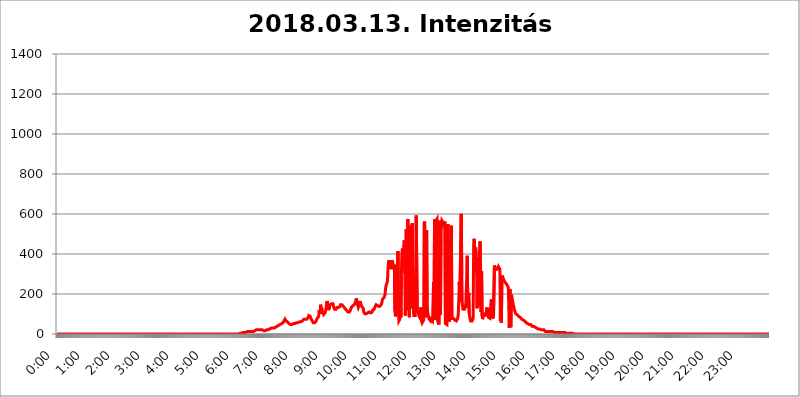
| Category | 2018.03.13. Intenzitás [W/m^2] |
|---|---|
| 0.0 | 0 |
| 0.0006944444444444445 | 0 |
| 0.001388888888888889 | 0 |
| 0.0020833333333333333 | 0 |
| 0.002777777777777778 | 0 |
| 0.003472222222222222 | 0 |
| 0.004166666666666667 | 0 |
| 0.004861111111111111 | 0 |
| 0.005555555555555556 | 0 |
| 0.0062499999999999995 | 0 |
| 0.006944444444444444 | 0 |
| 0.007638888888888889 | 0 |
| 0.008333333333333333 | 0 |
| 0.009027777777777779 | 0 |
| 0.009722222222222222 | 0 |
| 0.010416666666666666 | 0 |
| 0.011111111111111112 | 0 |
| 0.011805555555555555 | 0 |
| 0.012499999999999999 | 0 |
| 0.013194444444444444 | 0 |
| 0.013888888888888888 | 0 |
| 0.014583333333333332 | 0 |
| 0.015277777777777777 | 0 |
| 0.015972222222222224 | 0 |
| 0.016666666666666666 | 0 |
| 0.017361111111111112 | 0 |
| 0.018055555555555557 | 0 |
| 0.01875 | 0 |
| 0.019444444444444445 | 0 |
| 0.02013888888888889 | 0 |
| 0.020833333333333332 | 0 |
| 0.02152777777777778 | 0 |
| 0.022222222222222223 | 0 |
| 0.02291666666666667 | 0 |
| 0.02361111111111111 | 0 |
| 0.024305555555555556 | 0 |
| 0.024999999999999998 | 0 |
| 0.025694444444444447 | 0 |
| 0.02638888888888889 | 0 |
| 0.027083333333333334 | 0 |
| 0.027777777777777776 | 0 |
| 0.02847222222222222 | 0 |
| 0.029166666666666664 | 0 |
| 0.029861111111111113 | 0 |
| 0.030555555555555555 | 0 |
| 0.03125 | 0 |
| 0.03194444444444445 | 0 |
| 0.03263888888888889 | 0 |
| 0.03333333333333333 | 0 |
| 0.034027777777777775 | 0 |
| 0.034722222222222224 | 0 |
| 0.035416666666666666 | 0 |
| 0.036111111111111115 | 0 |
| 0.03680555555555556 | 0 |
| 0.0375 | 0 |
| 0.03819444444444444 | 0 |
| 0.03888888888888889 | 0 |
| 0.03958333333333333 | 0 |
| 0.04027777777777778 | 0 |
| 0.04097222222222222 | 0 |
| 0.041666666666666664 | 0 |
| 0.042361111111111106 | 0 |
| 0.04305555555555556 | 0 |
| 0.043750000000000004 | 0 |
| 0.044444444444444446 | 0 |
| 0.04513888888888889 | 0 |
| 0.04583333333333334 | 0 |
| 0.04652777777777778 | 0 |
| 0.04722222222222222 | 0 |
| 0.04791666666666666 | 0 |
| 0.04861111111111111 | 0 |
| 0.049305555555555554 | 0 |
| 0.049999999999999996 | 0 |
| 0.05069444444444445 | 0 |
| 0.051388888888888894 | 0 |
| 0.052083333333333336 | 0 |
| 0.05277777777777778 | 0 |
| 0.05347222222222222 | 0 |
| 0.05416666666666667 | 0 |
| 0.05486111111111111 | 0 |
| 0.05555555555555555 | 0 |
| 0.05625 | 0 |
| 0.05694444444444444 | 0 |
| 0.057638888888888885 | 0 |
| 0.05833333333333333 | 0 |
| 0.05902777777777778 | 0 |
| 0.059722222222222225 | 0 |
| 0.06041666666666667 | 0 |
| 0.061111111111111116 | 0 |
| 0.06180555555555556 | 0 |
| 0.0625 | 0 |
| 0.06319444444444444 | 0 |
| 0.06388888888888888 | 0 |
| 0.06458333333333334 | 0 |
| 0.06527777777777778 | 0 |
| 0.06597222222222222 | 0 |
| 0.06666666666666667 | 0 |
| 0.06736111111111111 | 0 |
| 0.06805555555555555 | 0 |
| 0.06874999999999999 | 0 |
| 0.06944444444444443 | 0 |
| 0.07013888888888889 | 0 |
| 0.07083333333333333 | 0 |
| 0.07152777777777779 | 0 |
| 0.07222222222222223 | 0 |
| 0.07291666666666667 | 0 |
| 0.07361111111111111 | 0 |
| 0.07430555555555556 | 0 |
| 0.075 | 0 |
| 0.07569444444444444 | 0 |
| 0.0763888888888889 | 0 |
| 0.07708333333333334 | 0 |
| 0.07777777777777778 | 0 |
| 0.07847222222222222 | 0 |
| 0.07916666666666666 | 0 |
| 0.0798611111111111 | 0 |
| 0.08055555555555556 | 0 |
| 0.08125 | 0 |
| 0.08194444444444444 | 0 |
| 0.08263888888888889 | 0 |
| 0.08333333333333333 | 0 |
| 0.08402777777777777 | 0 |
| 0.08472222222222221 | 0 |
| 0.08541666666666665 | 0 |
| 0.08611111111111112 | 0 |
| 0.08680555555555557 | 0 |
| 0.08750000000000001 | 0 |
| 0.08819444444444445 | 0 |
| 0.08888888888888889 | 0 |
| 0.08958333333333333 | 0 |
| 0.09027777777777778 | 0 |
| 0.09097222222222222 | 0 |
| 0.09166666666666667 | 0 |
| 0.09236111111111112 | 0 |
| 0.09305555555555556 | 0 |
| 0.09375 | 0 |
| 0.09444444444444444 | 0 |
| 0.09513888888888888 | 0 |
| 0.09583333333333333 | 0 |
| 0.09652777777777777 | 0 |
| 0.09722222222222222 | 0 |
| 0.09791666666666667 | 0 |
| 0.09861111111111111 | 0 |
| 0.09930555555555555 | 0 |
| 0.09999999999999999 | 0 |
| 0.10069444444444443 | 0 |
| 0.1013888888888889 | 0 |
| 0.10208333333333335 | 0 |
| 0.10277777777777779 | 0 |
| 0.10347222222222223 | 0 |
| 0.10416666666666667 | 0 |
| 0.10486111111111111 | 0 |
| 0.10555555555555556 | 0 |
| 0.10625 | 0 |
| 0.10694444444444444 | 0 |
| 0.1076388888888889 | 0 |
| 0.10833333333333334 | 0 |
| 0.10902777777777778 | 0 |
| 0.10972222222222222 | 0 |
| 0.1111111111111111 | 0 |
| 0.11180555555555556 | 0 |
| 0.11180555555555556 | 0 |
| 0.1125 | 0 |
| 0.11319444444444444 | 0 |
| 0.11388888888888889 | 0 |
| 0.11458333333333333 | 0 |
| 0.11527777777777777 | 0 |
| 0.11597222222222221 | 0 |
| 0.11666666666666665 | 0 |
| 0.1173611111111111 | 0 |
| 0.11805555555555557 | 0 |
| 0.11944444444444445 | 0 |
| 0.12013888888888889 | 0 |
| 0.12083333333333333 | 0 |
| 0.12152777777777778 | 0 |
| 0.12222222222222223 | 0 |
| 0.12291666666666667 | 0 |
| 0.12291666666666667 | 0 |
| 0.12361111111111112 | 0 |
| 0.12430555555555556 | 0 |
| 0.125 | 0 |
| 0.12569444444444444 | 0 |
| 0.12638888888888888 | 0 |
| 0.12708333333333333 | 0 |
| 0.16875 | 0 |
| 0.12847222222222224 | 0 |
| 0.12916666666666668 | 0 |
| 0.12986111111111112 | 0 |
| 0.13055555555555556 | 0 |
| 0.13125 | 0 |
| 0.13194444444444445 | 0 |
| 0.1326388888888889 | 0 |
| 0.13333333333333333 | 0 |
| 0.13402777777777777 | 0 |
| 0.13402777777777777 | 0 |
| 0.13472222222222222 | 0 |
| 0.13541666666666666 | 0 |
| 0.1361111111111111 | 0 |
| 0.13749999999999998 | 0 |
| 0.13819444444444443 | 0 |
| 0.1388888888888889 | 0 |
| 0.13958333333333334 | 0 |
| 0.14027777777777778 | 0 |
| 0.14097222222222222 | 0 |
| 0.14166666666666666 | 0 |
| 0.1423611111111111 | 0 |
| 0.14305555555555557 | 0 |
| 0.14375000000000002 | 0 |
| 0.14444444444444446 | 0 |
| 0.1451388888888889 | 0 |
| 0.1451388888888889 | 0 |
| 0.14652777777777778 | 0 |
| 0.14722222222222223 | 0 |
| 0.14791666666666667 | 0 |
| 0.1486111111111111 | 0 |
| 0.14930555555555555 | 0 |
| 0.15 | 0 |
| 0.15069444444444444 | 0 |
| 0.15138888888888888 | 0 |
| 0.15208333333333332 | 0 |
| 0.15277777777777776 | 0 |
| 0.15347222222222223 | 0 |
| 0.15416666666666667 | 0 |
| 0.15486111111111112 | 0 |
| 0.15555555555555556 | 0 |
| 0.15625 | 0 |
| 0.15694444444444444 | 0 |
| 0.15763888888888888 | 0 |
| 0.15833333333333333 | 0 |
| 0.15902777777777777 | 0 |
| 0.15972222222222224 | 0 |
| 0.16041666666666668 | 0 |
| 0.16111111111111112 | 0 |
| 0.16180555555555556 | 0 |
| 0.1625 | 0 |
| 0.16319444444444445 | 0 |
| 0.1638888888888889 | 0 |
| 0.16458333333333333 | 0 |
| 0.16527777777777777 | 0 |
| 0.16597222222222222 | 0 |
| 0.16666666666666666 | 0 |
| 0.1673611111111111 | 0 |
| 0.16805555555555554 | 0 |
| 0.16874999999999998 | 0 |
| 0.16944444444444443 | 0 |
| 0.17013888888888887 | 0 |
| 0.1708333333333333 | 0 |
| 0.17152777777777775 | 0 |
| 0.17222222222222225 | 0 |
| 0.1729166666666667 | 0 |
| 0.17361111111111113 | 0 |
| 0.17430555555555557 | 0 |
| 0.17500000000000002 | 0 |
| 0.17569444444444446 | 0 |
| 0.1763888888888889 | 0 |
| 0.17708333333333334 | 0 |
| 0.17777777777777778 | 0 |
| 0.17847222222222223 | 0 |
| 0.17916666666666667 | 0 |
| 0.1798611111111111 | 0 |
| 0.18055555555555555 | 0 |
| 0.18125 | 0 |
| 0.18194444444444444 | 0 |
| 0.1826388888888889 | 0 |
| 0.18333333333333335 | 0 |
| 0.1840277777777778 | 0 |
| 0.18472222222222223 | 0 |
| 0.18541666666666667 | 0 |
| 0.18611111111111112 | 0 |
| 0.18680555555555556 | 0 |
| 0.1875 | 0 |
| 0.18819444444444444 | 0 |
| 0.18888888888888888 | 0 |
| 0.18958333333333333 | 0 |
| 0.19027777777777777 | 0 |
| 0.1909722222222222 | 0 |
| 0.19166666666666665 | 0 |
| 0.19236111111111112 | 0 |
| 0.19305555555555554 | 0 |
| 0.19375 | 0 |
| 0.19444444444444445 | 0 |
| 0.1951388888888889 | 0 |
| 0.19583333333333333 | 0 |
| 0.19652777777777777 | 0 |
| 0.19722222222222222 | 0 |
| 0.19791666666666666 | 0 |
| 0.1986111111111111 | 0 |
| 0.19930555555555554 | 0 |
| 0.19999999999999998 | 0 |
| 0.20069444444444443 | 0 |
| 0.20138888888888887 | 0 |
| 0.2020833333333333 | 0 |
| 0.2027777777777778 | 0 |
| 0.2034722222222222 | 0 |
| 0.2041666666666667 | 0 |
| 0.20486111111111113 | 0 |
| 0.20555555555555557 | 0 |
| 0.20625000000000002 | 0 |
| 0.20694444444444446 | 0 |
| 0.2076388888888889 | 0 |
| 0.20833333333333334 | 0 |
| 0.20902777777777778 | 0 |
| 0.20972222222222223 | 0 |
| 0.21041666666666667 | 0 |
| 0.2111111111111111 | 0 |
| 0.21180555555555555 | 0 |
| 0.2125 | 0 |
| 0.21319444444444444 | 0 |
| 0.2138888888888889 | 0 |
| 0.21458333333333335 | 0 |
| 0.2152777777777778 | 0 |
| 0.21597222222222223 | 0 |
| 0.21666666666666667 | 0 |
| 0.21736111111111112 | 0 |
| 0.21805555555555556 | 0 |
| 0.21875 | 0 |
| 0.21944444444444444 | 0 |
| 0.22013888888888888 | 0 |
| 0.22083333333333333 | 0 |
| 0.22152777777777777 | 0 |
| 0.2222222222222222 | 0 |
| 0.22291666666666665 | 0 |
| 0.2236111111111111 | 0 |
| 0.22430555555555556 | 0 |
| 0.225 | 0 |
| 0.22569444444444445 | 0 |
| 0.2263888888888889 | 0 |
| 0.22708333333333333 | 0 |
| 0.22777777777777777 | 0 |
| 0.22847222222222222 | 0 |
| 0.22916666666666666 | 0 |
| 0.2298611111111111 | 0 |
| 0.23055555555555554 | 0 |
| 0.23124999999999998 | 0 |
| 0.23194444444444443 | 0 |
| 0.23263888888888887 | 0 |
| 0.2333333333333333 | 0 |
| 0.2340277777777778 | 0 |
| 0.2347222222222222 | 0 |
| 0.2354166666666667 | 0 |
| 0.23611111111111113 | 0 |
| 0.23680555555555557 | 0 |
| 0.23750000000000002 | 0 |
| 0.23819444444444446 | 0 |
| 0.2388888888888889 | 0 |
| 0.23958333333333334 | 0 |
| 0.24027777777777778 | 0 |
| 0.24097222222222223 | 0 |
| 0.24166666666666667 | 0 |
| 0.2423611111111111 | 0 |
| 0.24305555555555555 | 0 |
| 0.24375 | 0 |
| 0.24444444444444446 | 0 |
| 0.24513888888888888 | 0 |
| 0.24583333333333335 | 0 |
| 0.2465277777777778 | 0 |
| 0.24722222222222223 | 0 |
| 0.24791666666666667 | 0 |
| 0.24861111111111112 | 0 |
| 0.24930555555555556 | 0 |
| 0.25 | 0 |
| 0.25069444444444444 | 0 |
| 0.2513888888888889 | 0 |
| 0.2520833333333333 | 0 |
| 0.25277777777777777 | 0 |
| 0.2534722222222222 | 0 |
| 0.25416666666666665 | 0 |
| 0.2548611111111111 | 0 |
| 0.2555555555555556 | 0 |
| 0.25625000000000003 | 3.525 |
| 0.2569444444444445 | 3.525 |
| 0.2576388888888889 | 3.525 |
| 0.25833333333333336 | 3.525 |
| 0.2590277777777778 | 3.525 |
| 0.25972222222222224 | 3.525 |
| 0.2604166666666667 | 7.887 |
| 0.2611111111111111 | 7.887 |
| 0.26180555555555557 | 7.887 |
| 0.2625 | 7.887 |
| 0.26319444444444445 | 7.887 |
| 0.2638888888888889 | 7.887 |
| 0.26458333333333334 | 7.887 |
| 0.2652777777777778 | 7.887 |
| 0.2659722222222222 | 12.257 |
| 0.26666666666666666 | 12.257 |
| 0.2673611111111111 | 12.257 |
| 0.26805555555555555 | 12.257 |
| 0.26875 | 12.257 |
| 0.26944444444444443 | 12.257 |
| 0.2701388888888889 | 12.257 |
| 0.2708333333333333 | 12.257 |
| 0.27152777777777776 | 12.257 |
| 0.2722222222222222 | 12.257 |
| 0.27291666666666664 | 12.257 |
| 0.2736111111111111 | 12.257 |
| 0.2743055555555555 | 12.257 |
| 0.27499999999999997 | 12.257 |
| 0.27569444444444446 | 16.636 |
| 0.27638888888888885 | 16.636 |
| 0.27708333333333335 | 16.636 |
| 0.2777777777777778 | 16.636 |
| 0.27847222222222223 | 21.024 |
| 0.2791666666666667 | 21.024 |
| 0.2798611111111111 | 21.024 |
| 0.28055555555555556 | 21.024 |
| 0.28125 | 21.024 |
| 0.28194444444444444 | 21.024 |
| 0.2826388888888889 | 21.024 |
| 0.2833333333333333 | 21.024 |
| 0.28402777777777777 | 21.024 |
| 0.2847222222222222 | 21.024 |
| 0.28541666666666665 | 21.024 |
| 0.28611111111111115 | 21.024 |
| 0.28680555555555554 | 21.024 |
| 0.28750000000000003 | 21.024 |
| 0.2881944444444445 | 21.024 |
| 0.2888888888888889 | 16.636 |
| 0.28958333333333336 | 16.636 |
| 0.2902777777777778 | 16.636 |
| 0.29097222222222224 | 16.636 |
| 0.2916666666666667 | 16.636 |
| 0.2923611111111111 | 21.024 |
| 0.29305555555555557 | 21.024 |
| 0.29375 | 21.024 |
| 0.29444444444444445 | 21.024 |
| 0.2951388888888889 | 21.024 |
| 0.29583333333333334 | 21.024 |
| 0.2965277777777778 | 25.419 |
| 0.2972222222222222 | 25.419 |
| 0.29791666666666666 | 25.419 |
| 0.2986111111111111 | 25.419 |
| 0.29930555555555555 | 29.823 |
| 0.3 | 29.823 |
| 0.30069444444444443 | 29.823 |
| 0.3013888888888889 | 29.823 |
| 0.3020833333333333 | 29.823 |
| 0.30277777777777776 | 29.823 |
| 0.3034722222222222 | 29.823 |
| 0.30416666666666664 | 29.823 |
| 0.3048611111111111 | 29.823 |
| 0.3055555555555555 | 34.234 |
| 0.30624999999999997 | 34.234 |
| 0.3069444444444444 | 38.653 |
| 0.3076388888888889 | 38.653 |
| 0.30833333333333335 | 38.653 |
| 0.3090277777777778 | 38.653 |
| 0.30972222222222223 | 43.079 |
| 0.3104166666666667 | 43.079 |
| 0.3111111111111111 | 43.079 |
| 0.31180555555555556 | 47.511 |
| 0.3125 | 47.511 |
| 0.31319444444444444 | 47.511 |
| 0.3138888888888889 | 51.951 |
| 0.3145833333333333 | 51.951 |
| 0.31527777777777777 | 51.951 |
| 0.3159722222222222 | 51.951 |
| 0.31666666666666665 | 56.398 |
| 0.31736111111111115 | 56.398 |
| 0.31805555555555554 | 65.31 |
| 0.31875000000000003 | 65.31 |
| 0.3194444444444445 | 74.246 |
| 0.3201388888888889 | 69.775 |
| 0.32083333333333336 | 65.31 |
| 0.3215277777777778 | 65.31 |
| 0.32222222222222224 | 60.85 |
| 0.3229166666666667 | 60.85 |
| 0.3236111111111111 | 56.398 |
| 0.32430555555555557 | 56.398 |
| 0.325 | 51.951 |
| 0.32569444444444445 | 47.511 |
| 0.3263888888888889 | 47.511 |
| 0.32708333333333334 | 47.511 |
| 0.3277777777777778 | 47.511 |
| 0.3284722222222222 | 47.511 |
| 0.32916666666666666 | 47.511 |
| 0.3298611111111111 | 51.951 |
| 0.33055555555555555 | 51.951 |
| 0.33125 | 51.951 |
| 0.33194444444444443 | 51.951 |
| 0.3326388888888889 | 51.951 |
| 0.3333333333333333 | 51.951 |
| 0.3340277777777778 | 56.398 |
| 0.3347222222222222 | 56.398 |
| 0.3354166666666667 | 56.398 |
| 0.3361111111111111 | 56.398 |
| 0.3368055555555556 | 56.398 |
| 0.33749999999999997 | 56.398 |
| 0.33819444444444446 | 60.85 |
| 0.33888888888888885 | 60.85 |
| 0.33958333333333335 | 60.85 |
| 0.34027777777777773 | 60.85 |
| 0.34097222222222223 | 60.85 |
| 0.3416666666666666 | 60.85 |
| 0.3423611111111111 | 60.85 |
| 0.3430555555555555 | 60.85 |
| 0.34375 | 65.31 |
| 0.3444444444444445 | 65.31 |
| 0.3451388888888889 | 69.775 |
| 0.3458333333333334 | 74.246 |
| 0.34652777777777777 | 74.246 |
| 0.34722222222222227 | 74.246 |
| 0.34791666666666665 | 74.246 |
| 0.34861111111111115 | 74.246 |
| 0.34930555555555554 | 74.246 |
| 0.35000000000000003 | 74.246 |
| 0.3506944444444444 | 74.246 |
| 0.3513888888888889 | 78.722 |
| 0.3520833333333333 | 83.205 |
| 0.3527777777777778 | 92.184 |
| 0.3534722222222222 | 96.682 |
| 0.3541666666666667 | 92.184 |
| 0.3548611111111111 | 87.692 |
| 0.35555555555555557 | 83.205 |
| 0.35625 | 74.246 |
| 0.35694444444444445 | 69.775 |
| 0.3576388888888889 | 65.31 |
| 0.35833333333333334 | 60.85 |
| 0.3590277777777778 | 56.398 |
| 0.3597222222222222 | 56.398 |
| 0.36041666666666666 | 56.398 |
| 0.3611111111111111 | 56.398 |
| 0.36180555555555555 | 56.398 |
| 0.3625 | 60.85 |
| 0.36319444444444443 | 65.31 |
| 0.3638888888888889 | 65.31 |
| 0.3645833333333333 | 78.722 |
| 0.3652777777777778 | 74.246 |
| 0.3659722222222222 | 74.246 |
| 0.3666666666666667 | 87.692 |
| 0.3673611111111111 | 119.235 |
| 0.3680555555555556 | 119.235 |
| 0.36874999999999997 | 101.184 |
| 0.36944444444444446 | 146.423 |
| 0.37013888888888885 | 119.235 |
| 0.37083333333333335 | 132.814 |
| 0.37152777777777773 | 110.201 |
| 0.37222222222222223 | 110.201 |
| 0.3729166666666666 | 105.69 |
| 0.3736111111111111 | 96.682 |
| 0.3743055555555555 | 96.682 |
| 0.375 | 96.682 |
| 0.3756944444444445 | 105.69 |
| 0.3763888888888889 | 110.201 |
| 0.3770833333333334 | 128.284 |
| 0.37777777777777777 | 155.509 |
| 0.37847222222222227 | 164.605 |
| 0.37916666666666665 | 160.056 |
| 0.37986111111111115 | 137.347 |
| 0.38055555555555554 | 119.235 |
| 0.38125000000000003 | 123.758 |
| 0.3819444444444444 | 137.347 |
| 0.3826388888888889 | 146.423 |
| 0.3833333333333333 | 146.423 |
| 0.3840277777777778 | 146.423 |
| 0.3847222222222222 | 150.964 |
| 0.3854166666666667 | 150.964 |
| 0.3861111111111111 | 155.509 |
| 0.38680555555555557 | 150.964 |
| 0.3875 | 137.347 |
| 0.38819444444444445 | 137.347 |
| 0.3888888888888889 | 123.758 |
| 0.38958333333333334 | 119.235 |
| 0.3902777777777778 | 119.235 |
| 0.3909722222222222 | 123.758 |
| 0.39166666666666666 | 128.284 |
| 0.3923611111111111 | 132.814 |
| 0.39305555555555555 | 132.814 |
| 0.39375 | 132.814 |
| 0.39444444444444443 | 132.814 |
| 0.3951388888888889 | 132.814 |
| 0.3958333333333333 | 132.814 |
| 0.3965277777777778 | 137.347 |
| 0.3972222222222222 | 146.423 |
| 0.3979166666666667 | 146.423 |
| 0.3986111111111111 | 146.423 |
| 0.3993055555555556 | 146.423 |
| 0.39999999999999997 | 141.884 |
| 0.40069444444444446 | 141.884 |
| 0.40138888888888885 | 137.347 |
| 0.40208333333333335 | 141.884 |
| 0.40277777777777773 | 132.814 |
| 0.40347222222222223 | 128.284 |
| 0.4041666666666666 | 128.284 |
| 0.4048611111111111 | 123.758 |
| 0.4055555555555555 | 119.235 |
| 0.40625 | 119.235 |
| 0.4069444444444445 | 114.716 |
| 0.4076388888888889 | 110.201 |
| 0.4083333333333334 | 105.69 |
| 0.40902777777777777 | 110.201 |
| 0.40972222222222227 | 110.201 |
| 0.41041666666666665 | 114.716 |
| 0.41111111111111115 | 119.235 |
| 0.41180555555555554 | 123.758 |
| 0.41250000000000003 | 132.814 |
| 0.4131944444444444 | 132.814 |
| 0.4138888888888889 | 137.347 |
| 0.4145833333333333 | 141.884 |
| 0.4152777777777778 | 137.347 |
| 0.4159722222222222 | 137.347 |
| 0.4166666666666667 | 146.423 |
| 0.4173611111111111 | 146.423 |
| 0.41805555555555557 | 146.423 |
| 0.41875 | 164.605 |
| 0.41944444444444445 | 178.264 |
| 0.4201388888888889 | 178.264 |
| 0.42083333333333334 | 150.964 |
| 0.4215277777777778 | 155.509 |
| 0.4222222222222222 | 132.814 |
| 0.42291666666666666 | 137.347 |
| 0.4236111111111111 | 146.423 |
| 0.42430555555555555 | 155.509 |
| 0.425 | 164.605 |
| 0.42569444444444443 | 150.964 |
| 0.4263888888888889 | 146.423 |
| 0.4270833333333333 | 137.347 |
| 0.4277777777777778 | 132.814 |
| 0.4284722222222222 | 132.814 |
| 0.4291666666666667 | 128.284 |
| 0.4298611111111111 | 110.201 |
| 0.4305555555555556 | 105.69 |
| 0.43124999999999997 | 101.184 |
| 0.43194444444444446 | 101.184 |
| 0.43263888888888885 | 101.184 |
| 0.43333333333333335 | 101.184 |
| 0.43402777777777773 | 101.184 |
| 0.43472222222222223 | 101.184 |
| 0.4354166666666666 | 105.69 |
| 0.4361111111111111 | 105.69 |
| 0.4368055555555555 | 110.201 |
| 0.4375 | 110.201 |
| 0.4381944444444445 | 105.69 |
| 0.4388888888888889 | 105.69 |
| 0.4395833333333334 | 105.69 |
| 0.44027777777777777 | 105.69 |
| 0.44097222222222227 | 110.201 |
| 0.44166666666666665 | 110.201 |
| 0.44236111111111115 | 119.235 |
| 0.44305555555555554 | 119.235 |
| 0.44375000000000003 | 119.235 |
| 0.4444444444444444 | 123.758 |
| 0.4451388888888889 | 128.284 |
| 0.4458333333333333 | 137.347 |
| 0.4465277777777778 | 141.884 |
| 0.4472222222222222 | 146.423 |
| 0.4479166666666667 | 141.884 |
| 0.4486111111111111 | 141.884 |
| 0.44930555555555557 | 141.884 |
| 0.45 | 137.347 |
| 0.45069444444444445 | 137.347 |
| 0.4513888888888889 | 137.347 |
| 0.45208333333333334 | 137.347 |
| 0.4527777777777778 | 141.884 |
| 0.4534722222222222 | 141.884 |
| 0.45416666666666666 | 146.423 |
| 0.4548611111111111 | 150.964 |
| 0.45555555555555555 | 155.509 |
| 0.45625 | 173.709 |
| 0.45694444444444443 | 178.264 |
| 0.4576388888888889 | 173.709 |
| 0.4583333333333333 | 182.82 |
| 0.4590277777777778 | 178.264 |
| 0.4597222222222222 | 196.497 |
| 0.4604166666666667 | 223.873 |
| 0.4611111111111111 | 242.127 |
| 0.4618055555555556 | 242.127 |
| 0.46249999999999997 | 255.813 |
| 0.46319444444444446 | 264.932 |
| 0.46388888888888885 | 328.584 |
| 0.46458333333333335 | 355.712 |
| 0.46527777777777773 | 369.23 |
| 0.46597222222222223 | 355.712 |
| 0.4666666666666666 | 346.682 |
| 0.4673611111111111 | 342.162 |
| 0.4680555555555555 | 324.052 |
| 0.46875 | 342.162 |
| 0.4694444444444445 | 369.23 |
| 0.4701388888888889 | 369.23 |
| 0.4708333333333334 | 351.198 |
| 0.47152777777777777 | 333.113 |
| 0.47222222222222227 | 324.052 |
| 0.47291666666666665 | 346.682 |
| 0.47361111111111115 | 114.716 |
| 0.47430555555555554 | 87.692 |
| 0.47500000000000003 | 96.682 |
| 0.4756944444444444 | 214.746 |
| 0.4763888888888889 | 105.69 |
| 0.4770833333333333 | 96.682 |
| 0.4777777777777778 | 414.035 |
| 0.4784722222222222 | 146.423 |
| 0.4791666666666667 | 65.31 |
| 0.4798611111111111 | 60.85 |
| 0.48055555555555557 | 74.246 |
| 0.48125 | 178.264 |
| 0.48194444444444445 | 83.205 |
| 0.4826388888888889 | 292.259 |
| 0.48333333333333334 | 396.164 |
| 0.4840277777777778 | 427.39 |
| 0.4847222222222222 | 414.035 |
| 0.48541666666666666 | 427.39 |
| 0.4861111111111111 | 418.492 |
| 0.48680555555555555 | 467.187 |
| 0.4875 | 301.354 |
| 0.48819444444444443 | 92.184 |
| 0.4888888888888889 | 92.184 |
| 0.4895833333333333 | 523.88 |
| 0.4902777777777778 | 119.235 |
| 0.4909722222222222 | 173.709 |
| 0.4916666666666667 | 575.299 |
| 0.4923611111111111 | 571.049 |
| 0.4930555555555556 | 328.584 |
| 0.49374999999999997 | 83.205 |
| 0.49444444444444446 | 541.121 |
| 0.49513888888888885 | 480.356 |
| 0.49583333333333335 | 497.836 |
| 0.49652777777777773 | 128.284 |
| 0.49722222222222223 | 515.223 |
| 0.4979166666666666 | 553.986 |
| 0.4986111111111111 | 141.884 |
| 0.4993055555555555 | 132.814 |
| 0.5 | 92.184 |
| 0.5006944444444444 | 87.692 |
| 0.5013888888888889 | 92.184 |
| 0.5020833333333333 | 92.184 |
| 0.5027777777777778 | 87.692 |
| 0.5034722222222222 | 592.233 |
| 0.5041666666666667 | 596.45 |
| 0.5048611111111111 | 123.758 |
| 0.5055555555555555 | 105.69 |
| 0.50625 | 119.235 |
| 0.5069444444444444 | 96.682 |
| 0.5076388888888889 | 87.692 |
| 0.5083333333333333 | 83.205 |
| 0.5090277777777777 | 78.722 |
| 0.5097222222222222 | 132.814 |
| 0.5104166666666666 | 83.205 |
| 0.5111111111111112 | 65.31 |
| 0.5118055555555555 | 56.398 |
| 0.5125000000000001 | 51.951 |
| 0.5131944444444444 | 56.398 |
| 0.513888888888889 | 69.775 |
| 0.5145833333333333 | 553.986 |
| 0.5152777777777778 | 562.53 |
| 0.5159722222222222 | 110.201 |
| 0.5166666666666667 | 83.205 |
| 0.517361111111111 | 119.235 |
| 0.5180555555555556 | 519.555 |
| 0.5187499999999999 | 169.156 |
| 0.5194444444444445 | 110.201 |
| 0.5201388888888888 | 105.69 |
| 0.5208333333333334 | 87.692 |
| 0.5215277777777778 | 74.246 |
| 0.5222222222222223 | 78.722 |
| 0.5229166666666667 | 69.775 |
| 0.5236111111111111 | 65.31 |
| 0.5243055555555556 | 74.246 |
| 0.525 | 74.246 |
| 0.5256944444444445 | 69.775 |
| 0.5263888888888889 | 65.31 |
| 0.5270833333333333 | 65.31 |
| 0.5277777777777778 | 260.373 |
| 0.5284722222222222 | 83.205 |
| 0.5291666666666667 | 575.299 |
| 0.5298611111111111 | 101.184 |
| 0.5305555555555556 | 69.775 |
| 0.53125 | 566.793 |
| 0.5319444444444444 | 571.049 |
| 0.5326388888888889 | 575.299 |
| 0.5333333333333333 | 69.775 |
| 0.5340277777777778 | 56.398 |
| 0.5347222222222222 | 56.398 |
| 0.5354166666666667 | 47.511 |
| 0.5361111111111111 | 566.793 |
| 0.5368055555555555 | 132.814 |
| 0.5375 | 96.682 |
| 0.5381944444444444 | 502.192 |
| 0.5388888888888889 | 497.836 |
| 0.5395833333333333 | 566.793 |
| 0.5402777777777777 | 566.793 |
| 0.5409722222222222 | 558.261 |
| 0.5416666666666666 | 553.986 |
| 0.5423611111111112 | 549.704 |
| 0.5430555555555555 | 549.704 |
| 0.5437500000000001 | 562.53 |
| 0.5444444444444444 | 51.951 |
| 0.545138888888889 | 51.951 |
| 0.5458333333333333 | 51.951 |
| 0.5465277777777778 | 47.511 |
| 0.5472222222222222 | 373.729 |
| 0.5479166666666667 | 549.704 |
| 0.548611111111111 | 378.224 |
| 0.5493055555555556 | 74.246 |
| 0.5499999999999999 | 60.85 |
| 0.5506944444444445 | 60.85 |
| 0.5513888888888888 | 480.356 |
| 0.5520833333333334 | 69.775 |
| 0.5527777777777778 | 541.121 |
| 0.5534722222222223 | 83.205 |
| 0.5541666666666667 | 78.722 |
| 0.5548611111111111 | 78.722 |
| 0.5555555555555556 | 78.722 |
| 0.55625 | 74.246 |
| 0.5569444444444445 | 74.246 |
| 0.5576388888888889 | 69.775 |
| 0.5583333333333333 | 69.775 |
| 0.5590277777777778 | 65.31 |
| 0.5597222222222222 | 65.31 |
| 0.5604166666666667 | 65.31 |
| 0.5611111111111111 | 74.246 |
| 0.5618055555555556 | 83.205 |
| 0.5625 | 101.184 |
| 0.5631944444444444 | 169.156 |
| 0.5638888888888889 | 260.373 |
| 0.5645833333333333 | 160.056 |
| 0.5652777777777778 | 164.605 |
| 0.5659722222222222 | 155.509 |
| 0.5666666666666667 | 600.661 |
| 0.5673611111111111 | 296.808 |
| 0.5680555555555555 | 150.964 |
| 0.56875 | 132.814 |
| 0.5694444444444444 | 119.235 |
| 0.5701388888888889 | 146.423 |
| 0.5708333333333333 | 119.235 |
| 0.5715277777777777 | 128.284 |
| 0.5722222222222222 | 128.284 |
| 0.5729166666666666 | 137.347 |
| 0.5736111111111112 | 132.814 |
| 0.5743055555555555 | 287.709 |
| 0.5750000000000001 | 391.685 |
| 0.5756944444444444 | 182.82 |
| 0.576388888888889 | 132.814 |
| 0.5770833333333333 | 205.62 |
| 0.5777777777777778 | 101.184 |
| 0.5784722222222222 | 87.692 |
| 0.5791666666666667 | 74.246 |
| 0.579861111111111 | 65.31 |
| 0.5805555555555556 | 65.31 |
| 0.5812499999999999 | 65.31 |
| 0.5819444444444445 | 65.31 |
| 0.5826388888888888 | 69.775 |
| 0.5833333333333334 | 78.722 |
| 0.5840277777777778 | 436.27 |
| 0.5847222222222223 | 475.972 |
| 0.5854166666666667 | 471.582 |
| 0.5861111111111111 | 314.98 |
| 0.5868055555555556 | 431.833 |
| 0.5875 | 391.685 |
| 0.5881944444444445 | 305.898 |
| 0.5888888888888889 | 128.284 |
| 0.5895833333333333 | 305.898 |
| 0.5902777777777778 | 141.884 |
| 0.5909722222222222 | 382.715 |
| 0.5916666666666667 | 278.603 |
| 0.5923611111111111 | 418.492 |
| 0.5930555555555556 | 462.786 |
| 0.59375 | 319.517 |
| 0.5944444444444444 | 110.201 |
| 0.5951388888888889 | 314.98 |
| 0.5958333333333333 | 92.184 |
| 0.5965277777777778 | 74.246 |
| 0.5972222222222222 | 83.205 |
| 0.5979166666666667 | 96.682 |
| 0.5986111111111111 | 96.682 |
| 0.5993055555555555 | 92.184 |
| 0.6 | 101.184 |
| 0.6006944444444444 | 87.692 |
| 0.6013888888888889 | 101.184 |
| 0.6020833333333333 | 123.758 |
| 0.6027777777777777 | 132.814 |
| 0.6034722222222222 | 101.184 |
| 0.6041666666666666 | 128.284 |
| 0.6048611111111112 | 83.205 |
| 0.6055555555555555 | 83.205 |
| 0.6062500000000001 | 83.205 |
| 0.6069444444444444 | 78.722 |
| 0.607638888888889 | 101.184 |
| 0.6083333333333333 | 164.605 |
| 0.6090277777777778 | 173.709 |
| 0.6097222222222222 | 78.722 |
| 0.6104166666666667 | 87.692 |
| 0.611111111111111 | 83.205 |
| 0.6118055555555556 | 78.722 |
| 0.6124999999999999 | 78.722 |
| 0.6131944444444445 | 342.162 |
| 0.6138888888888888 | 333.113 |
| 0.6145833333333334 | 324.052 |
| 0.6152777777777778 | 328.584 |
| 0.6159722222222223 | 324.052 |
| 0.6166666666666667 | 324.052 |
| 0.6173611111111111 | 328.584 |
| 0.6180555555555556 | 333.113 |
| 0.61875 | 319.517 |
| 0.6194444444444445 | 333.113 |
| 0.6201388888888889 | 333.113 |
| 0.6208333333333333 | 324.052 |
| 0.6215277777777778 | 65.31 |
| 0.6222222222222222 | 283.156 |
| 0.6229166666666667 | 56.398 |
| 0.6236111111111111 | 274.047 |
| 0.6243055555555556 | 292.259 |
| 0.625 | 283.156 |
| 0.6256944444444444 | 274.047 |
| 0.6263888888888889 | 269.49 |
| 0.6270833333333333 | 269.49 |
| 0.6277777777777778 | 260.373 |
| 0.6284722222222222 | 260.373 |
| 0.6291666666666667 | 255.813 |
| 0.6298611111111111 | 251.251 |
| 0.6305555555555555 | 246.689 |
| 0.63125 | 242.127 |
| 0.6319444444444444 | 237.564 |
| 0.6326388888888889 | 233 |
| 0.6333333333333333 | 228.436 |
| 0.6340277777777777 | 29.823 |
| 0.6347222222222222 | 223.873 |
| 0.6354166666666666 | 214.746 |
| 0.6361111111111112 | 34.234 |
| 0.6368055555555555 | 196.497 |
| 0.6375000000000001 | 187.378 |
| 0.6381944444444444 | 173.709 |
| 0.638888888888889 | 160.056 |
| 0.6395833333333333 | 146.423 |
| 0.6402777777777778 | 137.347 |
| 0.6409722222222222 | 123.758 |
| 0.6416666666666667 | 114.716 |
| 0.642361111111111 | 110.201 |
| 0.6430555555555556 | 101.184 |
| 0.6437499999999999 | 101.184 |
| 0.6444444444444445 | 96.682 |
| 0.6451388888888888 | 96.682 |
| 0.6458333333333334 | 92.184 |
| 0.6465277777777778 | 92.184 |
| 0.6472222222222223 | 87.692 |
| 0.6479166666666667 | 83.205 |
| 0.6486111111111111 | 83.205 |
| 0.6493055555555556 | 83.205 |
| 0.65 | 78.722 |
| 0.6506944444444445 | 78.722 |
| 0.6513888888888889 | 74.246 |
| 0.6520833333333333 | 74.246 |
| 0.6527777777777778 | 69.775 |
| 0.6534722222222222 | 69.775 |
| 0.6541666666666667 | 65.31 |
| 0.6548611111111111 | 65.31 |
| 0.6555555555555556 | 65.31 |
| 0.65625 | 60.85 |
| 0.6569444444444444 | 60.85 |
| 0.6576388888888889 | 56.398 |
| 0.6583333333333333 | 56.398 |
| 0.6590277777777778 | 51.951 |
| 0.6597222222222222 | 51.951 |
| 0.6604166666666667 | 51.951 |
| 0.6611111111111111 | 47.511 |
| 0.6618055555555555 | 47.511 |
| 0.6625 | 47.511 |
| 0.6631944444444444 | 47.511 |
| 0.6638888888888889 | 47.511 |
| 0.6645833333333333 | 43.079 |
| 0.6652777777777777 | 43.079 |
| 0.6659722222222222 | 38.653 |
| 0.6666666666666666 | 38.653 |
| 0.6673611111111111 | 38.653 |
| 0.6680555555555556 | 38.653 |
| 0.6687500000000001 | 34.234 |
| 0.6694444444444444 | 34.234 |
| 0.6701388888888888 | 34.234 |
| 0.6708333333333334 | 29.823 |
| 0.6715277777777778 | 29.823 |
| 0.6722222222222222 | 29.823 |
| 0.6729166666666666 | 29.823 |
| 0.6736111111111112 | 25.419 |
| 0.6743055555555556 | 25.419 |
| 0.6749999999999999 | 25.419 |
| 0.6756944444444444 | 25.419 |
| 0.6763888888888889 | 25.419 |
| 0.6770833333333334 | 25.419 |
| 0.6777777777777777 | 21.024 |
| 0.6784722222222223 | 21.024 |
| 0.6791666666666667 | 21.024 |
| 0.6798611111111111 | 21.024 |
| 0.6805555555555555 | 21.024 |
| 0.68125 | 21.024 |
| 0.6819444444444445 | 16.636 |
| 0.6826388888888889 | 21.024 |
| 0.6833333333333332 | 16.636 |
| 0.6840277777777778 | 16.636 |
| 0.6847222222222222 | 12.257 |
| 0.6854166666666667 | 12.257 |
| 0.686111111111111 | 12.257 |
| 0.6868055555555556 | 12.257 |
| 0.6875 | 12.257 |
| 0.6881944444444444 | 12.257 |
| 0.688888888888889 | 12.257 |
| 0.6895833333333333 | 12.257 |
| 0.6902777777777778 | 12.257 |
| 0.6909722222222222 | 12.257 |
| 0.6916666666666668 | 12.257 |
| 0.6923611111111111 | 12.257 |
| 0.6930555555555555 | 12.257 |
| 0.69375 | 12.257 |
| 0.6944444444444445 | 12.257 |
| 0.6951388888888889 | 12.257 |
| 0.6958333333333333 | 12.257 |
| 0.6965277777777777 | 12.257 |
| 0.6972222222222223 | 7.887 |
| 0.6979166666666666 | 7.887 |
| 0.6986111111111111 | 7.887 |
| 0.6993055555555556 | 7.887 |
| 0.7000000000000001 | 7.887 |
| 0.7006944444444444 | 7.887 |
| 0.7013888888888888 | 7.887 |
| 0.7020833333333334 | 7.887 |
| 0.7027777777777778 | 7.887 |
| 0.7034722222222222 | 7.887 |
| 0.7041666666666666 | 7.887 |
| 0.7048611111111112 | 7.887 |
| 0.7055555555555556 | 7.887 |
| 0.7062499999999999 | 7.887 |
| 0.7069444444444444 | 7.887 |
| 0.7076388888888889 | 7.887 |
| 0.7083333333333334 | 7.887 |
| 0.7090277777777777 | 7.887 |
| 0.7097222222222223 | 7.887 |
| 0.7104166666666667 | 7.887 |
| 0.7111111111111111 | 3.525 |
| 0.7118055555555555 | 7.887 |
| 0.7125 | 7.887 |
| 0.7131944444444445 | 3.525 |
| 0.7138888888888889 | 3.525 |
| 0.7145833333333332 | 3.525 |
| 0.7152777777777778 | 3.525 |
| 0.7159722222222222 | 3.525 |
| 0.7166666666666667 | 3.525 |
| 0.717361111111111 | 3.525 |
| 0.7180555555555556 | 3.525 |
| 0.71875 | 3.525 |
| 0.7194444444444444 | 3.525 |
| 0.720138888888889 | 3.525 |
| 0.7208333333333333 | 3.525 |
| 0.7215277777777778 | 3.525 |
| 0.7222222222222222 | 3.525 |
| 0.7229166666666668 | 3.525 |
| 0.7236111111111111 | 0 |
| 0.7243055555555555 | 0 |
| 0.725 | 0 |
| 0.7256944444444445 | 0 |
| 0.7263888888888889 | 0 |
| 0.7270833333333333 | 0 |
| 0.7277777777777777 | 0 |
| 0.7284722222222223 | 0 |
| 0.7291666666666666 | 0 |
| 0.7298611111111111 | 0 |
| 0.7305555555555556 | 0 |
| 0.7312500000000001 | 0 |
| 0.7319444444444444 | 0 |
| 0.7326388888888888 | 0 |
| 0.7333333333333334 | 0 |
| 0.7340277777777778 | 0 |
| 0.7347222222222222 | 0 |
| 0.7354166666666666 | 0 |
| 0.7361111111111112 | 0 |
| 0.7368055555555556 | 0 |
| 0.7374999999999999 | 0 |
| 0.7381944444444444 | 0 |
| 0.7388888888888889 | 0 |
| 0.7395833333333334 | 0 |
| 0.7402777777777777 | 0 |
| 0.7409722222222223 | 0 |
| 0.7416666666666667 | 0 |
| 0.7423611111111111 | 0 |
| 0.7430555555555555 | 0 |
| 0.74375 | 0 |
| 0.7444444444444445 | 0 |
| 0.7451388888888889 | 0 |
| 0.7458333333333332 | 0 |
| 0.7465277777777778 | 0 |
| 0.7472222222222222 | 0 |
| 0.7479166666666667 | 0 |
| 0.748611111111111 | 0 |
| 0.7493055555555556 | 0 |
| 0.75 | 0 |
| 0.7506944444444444 | 0 |
| 0.751388888888889 | 0 |
| 0.7520833333333333 | 0 |
| 0.7527777777777778 | 0 |
| 0.7534722222222222 | 0 |
| 0.7541666666666668 | 0 |
| 0.7548611111111111 | 0 |
| 0.7555555555555555 | 0 |
| 0.75625 | 0 |
| 0.7569444444444445 | 0 |
| 0.7576388888888889 | 0 |
| 0.7583333333333333 | 0 |
| 0.7590277777777777 | 0 |
| 0.7597222222222223 | 0 |
| 0.7604166666666666 | 0 |
| 0.7611111111111111 | 0 |
| 0.7618055555555556 | 0 |
| 0.7625000000000001 | 0 |
| 0.7631944444444444 | 0 |
| 0.7638888888888888 | 0 |
| 0.7645833333333334 | 0 |
| 0.7652777777777778 | 0 |
| 0.7659722222222222 | 0 |
| 0.7666666666666666 | 0 |
| 0.7673611111111112 | 0 |
| 0.7680555555555556 | 0 |
| 0.7687499999999999 | 0 |
| 0.7694444444444444 | 0 |
| 0.7701388888888889 | 0 |
| 0.7708333333333334 | 0 |
| 0.7715277777777777 | 0 |
| 0.7722222222222223 | 0 |
| 0.7729166666666667 | 0 |
| 0.7736111111111111 | 0 |
| 0.7743055555555555 | 0 |
| 0.775 | 0 |
| 0.7756944444444445 | 0 |
| 0.7763888888888889 | 0 |
| 0.7770833333333332 | 0 |
| 0.7777777777777778 | 0 |
| 0.7784722222222222 | 0 |
| 0.7791666666666667 | 0 |
| 0.779861111111111 | 0 |
| 0.7805555555555556 | 0 |
| 0.78125 | 0 |
| 0.7819444444444444 | 0 |
| 0.782638888888889 | 0 |
| 0.7833333333333333 | 0 |
| 0.7840277777777778 | 0 |
| 0.7847222222222222 | 0 |
| 0.7854166666666668 | 0 |
| 0.7861111111111111 | 0 |
| 0.7868055555555555 | 0 |
| 0.7875 | 0 |
| 0.7881944444444445 | 0 |
| 0.7888888888888889 | 0 |
| 0.7895833333333333 | 0 |
| 0.7902777777777777 | 0 |
| 0.7909722222222223 | 0 |
| 0.7916666666666666 | 0 |
| 0.7923611111111111 | 0 |
| 0.7930555555555556 | 0 |
| 0.7937500000000001 | 0 |
| 0.7944444444444444 | 0 |
| 0.7951388888888888 | 0 |
| 0.7958333333333334 | 0 |
| 0.7965277777777778 | 0 |
| 0.7972222222222222 | 0 |
| 0.7979166666666666 | 0 |
| 0.7986111111111112 | 0 |
| 0.7993055555555556 | 0 |
| 0.7999999999999999 | 0 |
| 0.8006944444444444 | 0 |
| 0.8013888888888889 | 0 |
| 0.8020833333333334 | 0 |
| 0.8027777777777777 | 0 |
| 0.8034722222222223 | 0 |
| 0.8041666666666667 | 0 |
| 0.8048611111111111 | 0 |
| 0.8055555555555555 | 0 |
| 0.80625 | 0 |
| 0.8069444444444445 | 0 |
| 0.8076388888888889 | 0 |
| 0.8083333333333332 | 0 |
| 0.8090277777777778 | 0 |
| 0.8097222222222222 | 0 |
| 0.8104166666666667 | 0 |
| 0.811111111111111 | 0 |
| 0.8118055555555556 | 0 |
| 0.8125 | 0 |
| 0.8131944444444444 | 0 |
| 0.813888888888889 | 0 |
| 0.8145833333333333 | 0 |
| 0.8152777777777778 | 0 |
| 0.8159722222222222 | 0 |
| 0.8166666666666668 | 0 |
| 0.8173611111111111 | 0 |
| 0.8180555555555555 | 0 |
| 0.81875 | 0 |
| 0.8194444444444445 | 0 |
| 0.8201388888888889 | 0 |
| 0.8208333333333333 | 0 |
| 0.8215277777777777 | 0 |
| 0.8222222222222223 | 0 |
| 0.8229166666666666 | 0 |
| 0.8236111111111111 | 0 |
| 0.8243055555555556 | 0 |
| 0.8250000000000001 | 0 |
| 0.8256944444444444 | 0 |
| 0.8263888888888888 | 0 |
| 0.8270833333333334 | 0 |
| 0.8277777777777778 | 0 |
| 0.8284722222222222 | 0 |
| 0.8291666666666666 | 0 |
| 0.8298611111111112 | 0 |
| 0.8305555555555556 | 0 |
| 0.8312499999999999 | 0 |
| 0.8319444444444444 | 0 |
| 0.8326388888888889 | 0 |
| 0.8333333333333334 | 0 |
| 0.8340277777777777 | 0 |
| 0.8347222222222223 | 0 |
| 0.8354166666666667 | 0 |
| 0.8361111111111111 | 0 |
| 0.8368055555555555 | 0 |
| 0.8375 | 0 |
| 0.8381944444444445 | 0 |
| 0.8388888888888889 | 0 |
| 0.8395833333333332 | 0 |
| 0.8402777777777778 | 0 |
| 0.8409722222222222 | 0 |
| 0.8416666666666667 | 0 |
| 0.842361111111111 | 0 |
| 0.8430555555555556 | 0 |
| 0.84375 | 0 |
| 0.8444444444444444 | 0 |
| 0.845138888888889 | 0 |
| 0.8458333333333333 | 0 |
| 0.8465277777777778 | 0 |
| 0.8472222222222222 | 0 |
| 0.8479166666666668 | 0 |
| 0.8486111111111111 | 0 |
| 0.8493055555555555 | 0 |
| 0.85 | 0 |
| 0.8506944444444445 | 0 |
| 0.8513888888888889 | 0 |
| 0.8520833333333333 | 0 |
| 0.8527777777777777 | 0 |
| 0.8534722222222223 | 0 |
| 0.8541666666666666 | 0 |
| 0.8548611111111111 | 0 |
| 0.8555555555555556 | 0 |
| 0.8562500000000001 | 0 |
| 0.8569444444444444 | 0 |
| 0.8576388888888888 | 0 |
| 0.8583333333333334 | 0 |
| 0.8590277777777778 | 0 |
| 0.8597222222222222 | 0 |
| 0.8604166666666666 | 0 |
| 0.8611111111111112 | 0 |
| 0.8618055555555556 | 0 |
| 0.8624999999999999 | 0 |
| 0.8631944444444444 | 0 |
| 0.8638888888888889 | 0 |
| 0.8645833333333334 | 0 |
| 0.8652777777777777 | 0 |
| 0.8659722222222223 | 0 |
| 0.8666666666666667 | 0 |
| 0.8673611111111111 | 0 |
| 0.8680555555555555 | 0 |
| 0.86875 | 0 |
| 0.8694444444444445 | 0 |
| 0.8701388888888889 | 0 |
| 0.8708333333333332 | 0 |
| 0.8715277777777778 | 0 |
| 0.8722222222222222 | 0 |
| 0.8729166666666667 | 0 |
| 0.873611111111111 | 0 |
| 0.8743055555555556 | 0 |
| 0.875 | 0 |
| 0.8756944444444444 | 0 |
| 0.876388888888889 | 0 |
| 0.8770833333333333 | 0 |
| 0.8777777777777778 | 0 |
| 0.8784722222222222 | 0 |
| 0.8791666666666668 | 0 |
| 0.8798611111111111 | 0 |
| 0.8805555555555555 | 0 |
| 0.88125 | 0 |
| 0.8819444444444445 | 0 |
| 0.8826388888888889 | 0 |
| 0.8833333333333333 | 0 |
| 0.8840277777777777 | 0 |
| 0.8847222222222223 | 0 |
| 0.8854166666666666 | 0 |
| 0.8861111111111111 | 0 |
| 0.8868055555555556 | 0 |
| 0.8875000000000001 | 0 |
| 0.8881944444444444 | 0 |
| 0.8888888888888888 | 0 |
| 0.8895833333333334 | 0 |
| 0.8902777777777778 | 0 |
| 0.8909722222222222 | 0 |
| 0.8916666666666666 | 0 |
| 0.8923611111111112 | 0 |
| 0.8930555555555556 | 0 |
| 0.8937499999999999 | 0 |
| 0.8944444444444444 | 0 |
| 0.8951388888888889 | 0 |
| 0.8958333333333334 | 0 |
| 0.8965277777777777 | 0 |
| 0.8972222222222223 | 0 |
| 0.8979166666666667 | 0 |
| 0.8986111111111111 | 0 |
| 0.8993055555555555 | 0 |
| 0.9 | 0 |
| 0.9006944444444445 | 0 |
| 0.9013888888888889 | 0 |
| 0.9020833333333332 | 0 |
| 0.9027777777777778 | 0 |
| 0.9034722222222222 | 0 |
| 0.9041666666666667 | 0 |
| 0.904861111111111 | 0 |
| 0.9055555555555556 | 0 |
| 0.90625 | 0 |
| 0.9069444444444444 | 0 |
| 0.907638888888889 | 0 |
| 0.9083333333333333 | 0 |
| 0.9090277777777778 | 0 |
| 0.9097222222222222 | 0 |
| 0.9104166666666668 | 0 |
| 0.9111111111111111 | 0 |
| 0.9118055555555555 | 0 |
| 0.9125 | 0 |
| 0.9131944444444445 | 0 |
| 0.9138888888888889 | 0 |
| 0.9145833333333333 | 0 |
| 0.9152777777777777 | 0 |
| 0.9159722222222223 | 0 |
| 0.9166666666666666 | 0 |
| 0.9173611111111111 | 0 |
| 0.9180555555555556 | 0 |
| 0.9187500000000001 | 0 |
| 0.9194444444444444 | 0 |
| 0.9201388888888888 | 0 |
| 0.9208333333333334 | 0 |
| 0.9215277777777778 | 0 |
| 0.9222222222222222 | 0 |
| 0.9229166666666666 | 0 |
| 0.9236111111111112 | 0 |
| 0.9243055555555556 | 0 |
| 0.9249999999999999 | 0 |
| 0.9256944444444444 | 0 |
| 0.9263888888888889 | 0 |
| 0.9270833333333334 | 0 |
| 0.9277777777777777 | 0 |
| 0.9284722222222223 | 0 |
| 0.9291666666666667 | 0 |
| 0.9298611111111111 | 0 |
| 0.9305555555555555 | 0 |
| 0.93125 | 0 |
| 0.9319444444444445 | 0 |
| 0.9326388888888889 | 0 |
| 0.9333333333333332 | 0 |
| 0.9340277777777778 | 0 |
| 0.9347222222222222 | 0 |
| 0.9354166666666667 | 0 |
| 0.936111111111111 | 0 |
| 0.9368055555555556 | 0 |
| 0.9375 | 0 |
| 0.9381944444444444 | 0 |
| 0.938888888888889 | 0 |
| 0.9395833333333333 | 0 |
| 0.9402777777777778 | 0 |
| 0.9409722222222222 | 0 |
| 0.9416666666666668 | 0 |
| 0.9423611111111111 | 0 |
| 0.9430555555555555 | 0 |
| 0.94375 | 0 |
| 0.9444444444444445 | 0 |
| 0.9451388888888889 | 0 |
| 0.9458333333333333 | 0 |
| 0.9465277777777777 | 0 |
| 0.9472222222222223 | 0 |
| 0.9479166666666666 | 0 |
| 0.9486111111111111 | 0 |
| 0.9493055555555556 | 0 |
| 0.9500000000000001 | 0 |
| 0.9506944444444444 | 0 |
| 0.9513888888888888 | 0 |
| 0.9520833333333334 | 0 |
| 0.9527777777777778 | 0 |
| 0.9534722222222222 | 0 |
| 0.9541666666666666 | 0 |
| 0.9548611111111112 | 0 |
| 0.9555555555555556 | 0 |
| 0.9562499999999999 | 0 |
| 0.9569444444444444 | 0 |
| 0.9576388888888889 | 0 |
| 0.9583333333333334 | 0 |
| 0.9590277777777777 | 0 |
| 0.9597222222222223 | 0 |
| 0.9604166666666667 | 0 |
| 0.9611111111111111 | 0 |
| 0.9618055555555555 | 0 |
| 0.9625 | 0 |
| 0.9631944444444445 | 0 |
| 0.9638888888888889 | 0 |
| 0.9645833333333332 | 0 |
| 0.9652777777777778 | 0 |
| 0.9659722222222222 | 0 |
| 0.9666666666666667 | 0 |
| 0.967361111111111 | 0 |
| 0.9680555555555556 | 0 |
| 0.96875 | 0 |
| 0.9694444444444444 | 0 |
| 0.970138888888889 | 0 |
| 0.9708333333333333 | 0 |
| 0.9715277777777778 | 0 |
| 0.9722222222222222 | 0 |
| 0.9729166666666668 | 0 |
| 0.9736111111111111 | 0 |
| 0.9743055555555555 | 0 |
| 0.975 | 0 |
| 0.9756944444444445 | 0 |
| 0.9763888888888889 | 0 |
| 0.9770833333333333 | 0 |
| 0.9777777777777777 | 0 |
| 0.9784722222222223 | 0 |
| 0.9791666666666666 | 0 |
| 0.9798611111111111 | 0 |
| 0.9805555555555556 | 0 |
| 0.9812500000000001 | 0 |
| 0.9819444444444444 | 0 |
| 0.9826388888888888 | 0 |
| 0.9833333333333334 | 0 |
| 0.9840277777777778 | 0 |
| 0.9847222222222222 | 0 |
| 0.9854166666666666 | 0 |
| 0.9861111111111112 | 0 |
| 0.9868055555555556 | 0 |
| 0.9874999999999999 | 0 |
| 0.9881944444444444 | 0 |
| 0.9888888888888889 | 0 |
| 0.9895833333333334 | 0 |
| 0.9902777777777777 | 0 |
| 0.9909722222222223 | 0 |
| 0.9916666666666667 | 0 |
| 0.9923611111111111 | 0 |
| 0.9930555555555555 | 0 |
| 0.99375 | 0 |
| 0.9944444444444445 | 0 |
| 0.9951388888888889 | 0 |
| 0.9958333333333332 | 0 |
| 0.9965277777777778 | 0 |
| 0.9972222222222222 | 0 |
| 0.9979166666666667 | 0 |
| 0.998611111111111 | 0 |
| 0.9993055555555556 | 0 |